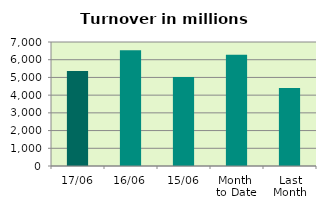
| Category | Series 0 |
|---|---|
| 17/06 | 5366.818 |
| 16/06 | 6539.266 |
| 15/06 | 5027.421 |
| Month 
to Date | 6278.128 |
| Last
Month | 4406.275 |